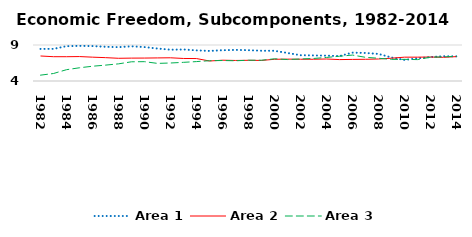
| Category | Area 1 | Area 2 | Area 3 |
|---|---|---|---|
| 1982.0 | 8.455 | 7.473 | 4.813 |
| 1983.0 | 8.462 | 7.375 | 5.041 |
| 1984.0 | 8.838 | 7.374 | 5.571 |
| 1985.0 | 8.878 | 7.393 | 5.838 |
| 1986.0 | 8.85 | 7.312 | 6.05 |
| 1987.0 | 8.752 | 7.243 | 6.205 |
| 1988.0 | 8.701 | 7.154 | 6.382 |
| 1989.0 | 8.817 | 7.178 | 6.667 |
| 1990.0 | 8.71 | 7.184 | 6.685 |
| 1991.0 | 8.509 | 7.206 | 6.446 |
| 1992.0 | 8.349 | 7.224 | 6.5 |
| 1993.0 | 8.376 | 7.128 | 6.591 |
| 1994.0 | 8.256 | 7.117 | 6.696 |
| 1995.0 | 8.177 | 6.777 | 6.818 |
| 1996.0 | 8.276 | 6.887 | 6.845 |
| 1997.0 | 8.319 | 6.854 | 6.811 |
| 1998.0 | 8.282 | 6.874 | 6.884 |
| 1999.0 | 8.199 | 6.857 | 6.881 |
| 2000.0 | 8.198 | 7.016 | 7.084 |
| 2001.0 | 7.89 | 7.038 | 6.98 |
| 2002.0 | 7.582 | 7.023 | 7.057 |
| 2003.0 | 7.55 | 7.019 | 7.13 |
| 2004.0 | 7.519 | 7.056 | 7.272 |
| 2005.0 | 7.465 | 6.975 | 7.439 |
| 2006.0 | 7.94 | 6.998 | 7.602 |
| 2007.0 | 7.894 | 7.015 | 7.29 |
| 2008.0 | 7.76 | 7.057 | 7.161 |
| 2009.0 | 7.267 | 7.165 | 7.003 |
| 2010.0 | 6.926 | 7.31 | 7.006 |
| 2011.0 | 7.147 | 7.311 | 6.973 |
| 2012.0 | 7.325 | 7.331 | 7.31 |
| 2013.0 | 7.444 | 7.289 | 7.346 |
| 2014.0 | 7.418 | 7.385 | 7.437 |